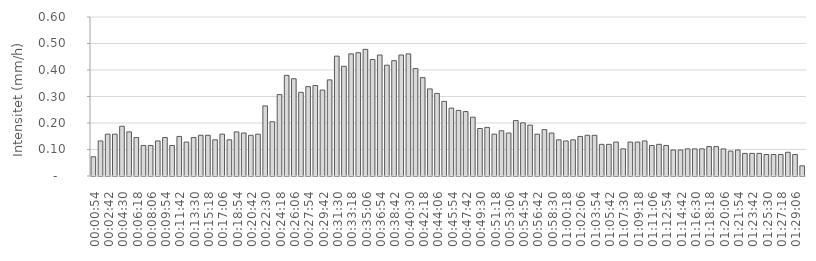
| Category | Intensitet (mm/h) |
|---|---|
|  00:00:54  | 0.073 |
|  00:01:48  | 0.132 |
|  00:02:42  | 0.158 |
|  00:03:36  | 0.158 |
|  00:04:30  | 0.188 |
|  00:05:24  | 0.166 |
|  00:06:18  | 0.145 |
|  00:07:12  | 0.115 |
|  00:08:06  | 0.115 |
|  00:09:00  | 0.132 |
|  00:09:54  | 0.145 |
|  00:10:48  | 0.115 |
|  00:11:42  | 0.149 |
|  00:12:36  | 0.128 |
|  00:13:30  | 0.145 |
|  00:14:24  | 0.154 |
|  00:15:18  | 0.154 |
|  00:16:12  | 0.137 |
|  00:17:06  | 0.158 |
|  00:18:00  | 0.137 |
|  00:18:54  | 0.166 |
|  00:19:48  | 0.162 |
|  00:20:42  | 0.154 |
|  00:21:36  | 0.158 |
|  00:22:30  | 0.265 |
|  00:23:24  | 0.205 |
|  00:24:18  | 0.307 |
|  00:25:12  | 0.38 |
|  00:26:06  | 0.367 |
|  00:27:00  | 0.316 |
|  00:27:54  | 0.337 |
|  00:28:48  | 0.341 |
|  00:29:42  | 0.324 |
|  00:30:36  | 0.363 |
|  00:31:30  | 0.452 |
|  00:32:24  | 0.414 |
|  00:33:18  | 0.461 |
|  00:34:12  | 0.465 |
|  00:35:06  | 0.478 |
|  00:36:00  | 0.44 |
|  00:36:54  | 0.457 |
|  00:37:48  | 0.418 |
|  00:38:42  | 0.435 |
|  00:39:36  | 0.457 |
|  00:40:30  | 0.461 |
|  00:41:24  | 0.405 |
|  00:42:18  | 0.371 |
|  00:43:12  | 0.329 |
|  00:44:06  | 0.312 |
|  00:45:00  | 0.282 |
|  00:45:54  | 0.256 |
|  00:46:48  | 0.247 |
|  00:47:42  | 0.243 |
|  00:48:36  | 0.222 |
|  00:49:30  | 0.179 |
|  00:50:24  | 0.183 |
|  00:51:18  | 0.158 |
|  00:52:12  | 0.171 |
|  00:53:06  | 0.162 |
|  00:54:00  | 0.209 |
|  00:54:54  | 0.201 |
|  00:55:48  | 0.192 |
|  00:56:42  | 0.158 |
|  00:57:36  | 0.175 |
|  00:58:30  | 0.162 |
|  00:59:24  | 0.137 |
|  01:00:18  | 0.132 |
|  01:01:12  | 0.137 |
|  01:02:06  | 0.149 |
|  01:03:00  | 0.154 |
|  01:03:54  | 0.154 |
|  01:04:48  | 0.119 |
|  01:05:42  | 0.119 |
|  01:06:36  | 0.128 |
|  01:07:30  | 0.102 |
|  01:08:24  | 0.128 |
|  01:09:18  | 0.128 |
|  01:10:12  | 0.132 |
|  01:11:06  | 0.115 |
|  01:12:00  | 0.119 |
|  01:12:54  | 0.115 |
|  01:13:48  | 0.098 |
|  01:14:42  | 0.098 |
|  01:15:36  | 0.102 |
|  01:16:30  | 0.102 |
|  01:17:24  | 0.102 |
|  01:18:18  | 0.111 |
|  01:19:12  | 0.111 |
|  01:20:06  | 0.102 |
|  01:21:00  | 0.094 |
|  01:21:54  | 0.098 |
|  01:22:48  | 0.085 |
|  01:23:42  | 0.085 |
|  01:24:36  | 0.085 |
|  01:25:30  | 0.081 |
|  01:26:24  | 0.081 |
|  01:27:18  | 0.081 |
|  01:28:12  | 0.09 |
|  01:29:06  | 0.081 |
|  01:30:00  | 0.038 |